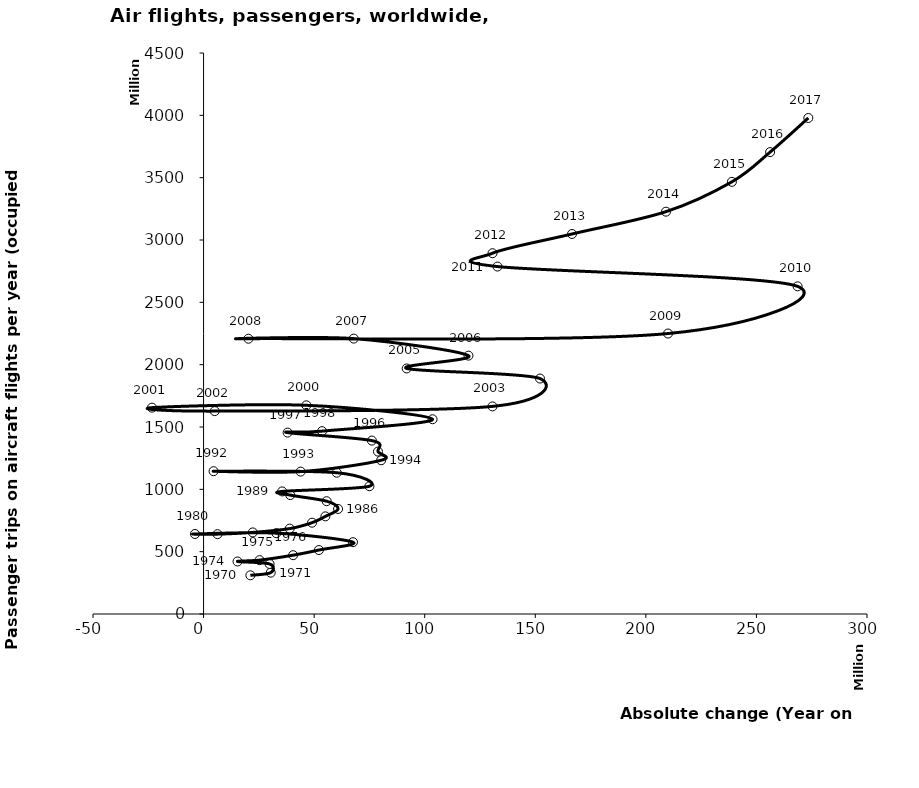
| Category | Series 0 |
|---|---|
| 21163512.0 | 310441392 |
| 30376802.666666668 | 331604904 |
| 29846765.333333332 | 401571800 |
| 15352350.0 | 421145200 |
| 25314098.0 | 432276500 |
| 40496396.0 | 471773396 |
| 52158304.0 | 513269292 |
| 67565654.0 | 576090004 |
| 32891442.0 | 648400600 |
| -3890600.0 | 641872888 |
| 6304610.0 | 640619400 |
| 22241098.0 | 654482108 |
| 38964090.0 | 685101596 |
| 49048254.0 | 732410288 |
| 55092004.0 | 783198104 |
| 60820000.0 | 842594296 |
| 55650858.0 | 904838104 |
| 39185348.0 | 953896012 |
| 35540302.0 | 983208800 |
| 75009702.0 | 1024976616 |
| 60230038.0 | 1133228204 |
| 4518506.0 | 1145436692 |
| 43898356.0 | 1142265216 |
| 80313212.04999995 | 1233233404 |
| 78865150.0 | 1302891640.1 |
| 76106275.95000005 | 1390963704 |
| 37999038.0 | 1455104192 |
| 53576054.0 | 1466961780 |
| 103551466.0 | 1562256300 |
| 46486957.0 | 1674064712 |
| -23329919.5 | 1655230214 |
| 5039534.5 | 1627404873 |
| 130645205.5 | 1665309283 |
| 152140758.0 | 1888695284 |
| 91859307.0 | 1969590799 |
| 119772848.5 | 2072413898 |
| 67902419.5 | 2209136496 |
| 20296025.0 | 2208218737 |
| 210021260.60497046 | 2249728546 |
| 268612642.0910351 | 2628261258.21 |
| 132896856.6774745 | 2786953830.182 |
| 130660621.49530125 | 2894054971.565 |
| 166618207.4555025 | 3048275073.173 |
| 209101705.91366363 | 3227291386.476 |
| 238905255.26205254 | 3466478485 |
| 256185458.5 | 3705101897 |
| 273465661.73794746 | 3978849402 |